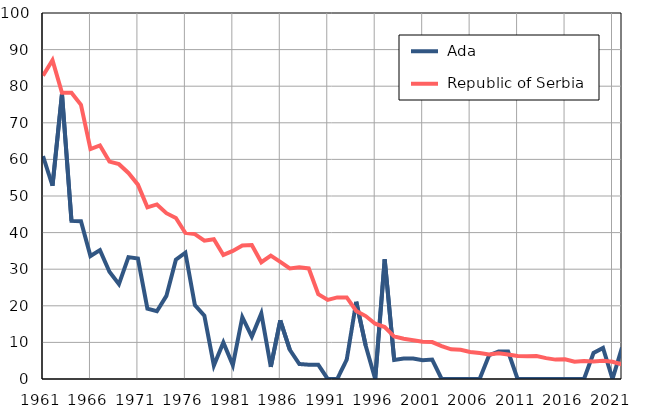
| Category |  Ada |  Republic of Serbia |
|---|---|---|
| 1961.0 | 60.9 | 82.9 |
| 1962.0 | 52.8 | 87.1 |
| 1963.0 | 77.9 | 78.2 |
| 1964.0 | 43.2 | 78.2 |
| 1965.0 | 43.1 | 74.9 |
| 1966.0 | 33.6 | 62.8 |
| 1967.0 | 35.2 | 63.8 |
| 1968.0 | 29.3 | 59.4 |
| 1969.0 | 25.9 | 58.7 |
| 1970.0 | 33.3 | 56.3 |
| 1971.0 | 32.9 | 53.1 |
| 1972.0 | 19.2 | 46.9 |
| 1973.0 | 18.5 | 47.7 |
| 1974.0 | 22.7 | 45.3 |
| 1975.0 | 32.6 | 44 |
| 1976.0 | 34.5 | 39.9 |
| 1977.0 | 20.2 | 39.6 |
| 1978.0 | 17.3 | 37.8 |
| 1979.0 | 3.7 | 38.2 |
| 1980.0 | 10 | 33.9 |
| 1981.0 | 3.8 | 35 |
| 1982.0 | 16.9 | 36.5 |
| 1983.0 | 11.6 | 36.6 |
| 1984.0 | 17.9 | 31.9 |
| 1985.0 | 3.3 | 33.7 |
| 1986.0 | 16 | 32 |
| 1987.0 | 8 | 30.2 |
| 1988.0 | 4.1 | 30.5 |
| 1989.0 | 3.9 | 30.2 |
| 1990.0 | 3.9 | 23.2 |
| 1991.0 | 0 | 21.6 |
| 1992.0 | 0 | 22.3 |
| 1993.0 | 5.3 | 22.3 |
| 1994.0 | 21.1 | 18.6 |
| 1995.0 | 9.1 | 17.2 |
| 1996.0 | 0 | 15.1 |
| 1997.0 | 32.7 | 14.2 |
| 1998.0 | 5.2 | 11.6 |
| 1999.0 | 5.6 | 11 |
| 2000.0 | 5.6 | 10.6 |
| 2001.0 | 5.1 | 10.2 |
| 2002.0 | 5.3 | 10.1 |
| 2003.0 | 0 | 9 |
| 2004.0 | 0 | 8.1 |
| 2005.0 | 0 | 8 |
| 2006.0 | 0 | 7.4 |
| 2007.0 | 0 | 7.1 |
| 2008.0 | 6.5 | 6.7 |
| 2009.0 | 7.5 | 7 |
| 2010.0 | 7.5 | 6.7 |
| 2011.0 | 0 | 6.3 |
| 2012.0 | 0 | 6.2 |
| 2013.0 | 0 | 6.3 |
| 2014.0 | 0 | 5.7 |
| 2015.0 | 0 | 5.3 |
| 2016.0 | 0 | 5.4 |
| 2017.0 | 0 | 4.7 |
| 2018.0 | 0 | 4.9 |
| 2019.0 | 7.1 | 4.8 |
| 2020.0 | 8.5 | 5 |
| 2021.0 | 0 | 4.7 |
| 2022.0 | 8.6 | 4 |